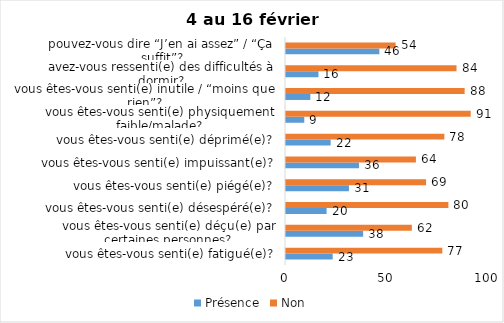
| Category | Présence | Non |
|---|---|---|
| vous êtes-vous senti(e) fatigué(e)? | 23 | 77 |
| vous êtes-vous senti(e) déçu(e) par certaines personnes? | 38 | 62 |
| vous êtes-vous senti(e) désespéré(e)? | 20 | 80 |
| vous êtes-vous senti(e) piégé(e)? | 31 | 69 |
| vous êtes-vous senti(e) impuissant(e)? | 36 | 64 |
| vous êtes-vous senti(e) déprimé(e)? | 22 | 78 |
| vous êtes-vous senti(e) physiquement faible/malade? | 9 | 91 |
| vous êtes-vous senti(e) inutile / “moins que rien”? | 12 | 88 |
| avez-vous ressenti(e) des difficultés à dormir? | 16 | 84 |
| pouvez-vous dire “J’en ai assez” / “Ça suffit”? | 46 | 54 |